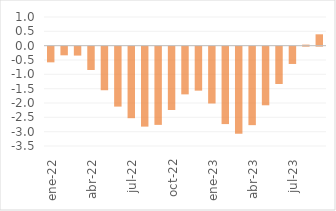
| Category | Total |
|---|---|
| ene-22 | -0.547 |
| feb-22 | -0.302 |
| mar-22 | -0.311 |
| abr-22 | -0.814 |
| may-22 | -1.52 |
| jun-22 | -2.091 |
| jul-22 | -2.495 |
| ago-22 | -2.789 |
| sep-22 | -2.729 |
| oct-22 | -2.21 |
| nov-22 | -1.664 |
| dic-22 | -1.534 |
| ene-23 | -1.982 |
| feb-23 | -2.701 |
| mar-23 | -3.042 |
| abr-23 | -2.738 |
| may-23 | -2.045 |
| jun-23 | -1.302 |
| jul-23 | -0.604 |
| ago-23 | 0.037 |
| sep-23 | 0.397 |